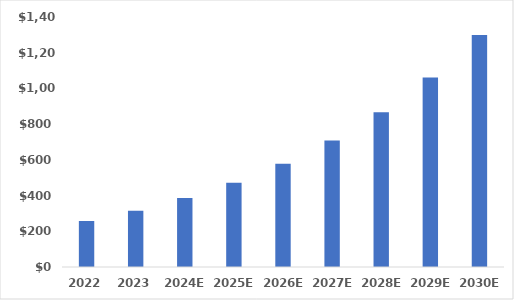
| Category | Series 0 |
|---|---|
| 2022 | 257.47 |
| 2023 | 315.195 |
| 2024E | 385.861 |
| 2025E | 472.372 |
| 2026E | 578.277 |
| 2027E | 707.927 |
| 2028E | 866.644 |
| 2029E | 1060.946 |
| 2030E | 1298.81 |